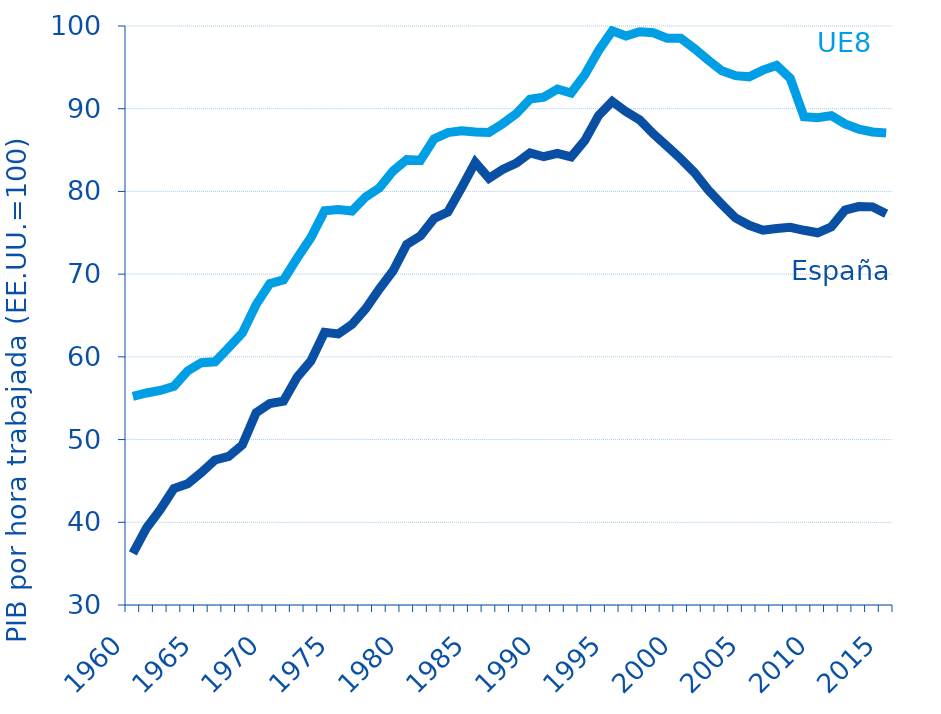
| Category |  España |  UE8 |
|---|---|---|
| 1960.0 | 36.227 | 55.229 |
| 1961.0 | 39.312 | 55.634 |
| 1962.0 | 41.52 | 55.939 |
| 1963.0 | 44.084 | 56.44 |
| 1964.0 | 44.653 | 58.298 |
| 1965.0 | 46.01 | 59.295 |
| 1966.0 | 47.536 | 59.403 |
| 1967.0 | 47.971 | 61.121 |
| 1968.0 | 49.365 | 62.891 |
| 1969.0 | 53.239 | 66.317 |
| 1970.0 | 54.352 | 68.853 |
| 1971.0 | 54.638 | 69.31 |
| 1972.0 | 57.558 | 71.947 |
| 1973.0 | 59.506 | 74.416 |
| 1974.0 | 62.975 | 77.653 |
| 1975.0 | 62.779 | 77.817 |
| 1976.0 | 63.925 | 77.643 |
| 1977.0 | 65.817 | 79.333 |
| 1978.0 | 68.207 | 80.424 |
| 1979.0 | 70.408 | 82.471 |
| 1980.0 | 73.593 | 83.849 |
| 1981.0 | 74.642 | 83.769 |
| 1982.0 | 76.739 | 86.365 |
| 1983.0 | 77.517 | 87.116 |
| 1984.0 | 80.445 | 87.338 |
| 1985.0 | 83.508 | 87.181 |
| 1986.0 | 81.595 | 87.134 |
| 1987.0 | 82.659 | 88.189 |
| 1988.0 | 83.415 | 89.418 |
| 1989.0 | 84.664 | 91.155 |
| 1990.0 | 84.195 | 91.407 |
| 1991.0 | 84.586 | 92.38 |
| 1992.0 | 84.178 | 91.903 |
| 1993.0 | 86.165 | 94.106 |
| 1994.0 | 89.167 | 97.007 |
| 1995.0 | 90.879 | 99.416 |
| 1996.0 | 89.658 | 98.799 |
| 1997.0 | 88.648 | 99.313 |
| 1998.0 | 86.96 | 99.19 |
| 1999.0 | 85.481 | 98.533 |
| 2000.0 | 83.943 | 98.532 |
| 2001.0 | 82.284 | 97.263 |
| 2002.0 | 80.187 | 95.889 |
| 2003.0 | 78.437 | 94.591 |
| 2004.0 | 76.796 | 93.996 |
| 2005.0 | 75.904 | 93.856 |
| 2006.0 | 75.315 | 94.669 |
| 2007.0 | 75.527 | 95.23 |
| 2008.0 | 75.67 | 93.666 |
| 2009.0 | 75.302 | 89.024 |
| 2010.0 | 75.002 | 88.913 |
| 2011.0 | 75.713 | 89.168 |
| 2012.0 | 77.747 | 88.159 |
| 2013.0 | 78.174 | 87.539 |
| 2014.0 | 78.135 | 87.19 |
| 2015.0 | 77.294 | 87.07 |